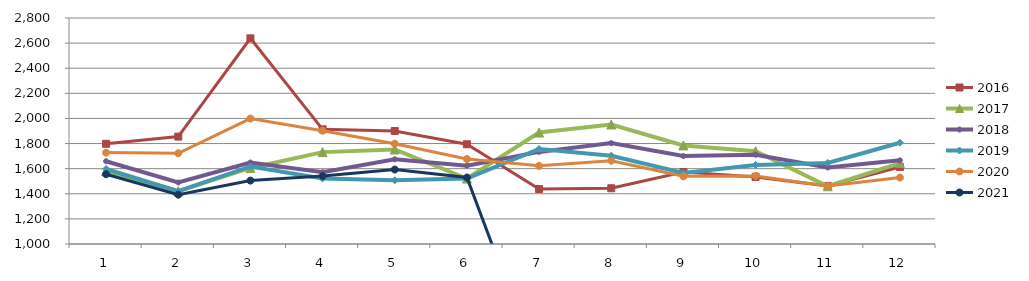
| Category | 2015 | 2016 | 2017 | 2018 | 2019 | 2020 | 2021 |
|---|---|---|---|---|---|---|---|
| 0 |  | 1798.146 | 1579.519 | 1659.233 | 1597.182 | 1727.767 | 1555.724 |
| 1 |  | 1855.266 | 1419.892 | 1490.116 | 1420.981 | 1722.949 | 1392.893 |
| 2 |  | 2637.962 | 1605.876 | 1649.429 | 1617.601 | 1999.15 | 1504.855 |
| 3 |  | 1913.237 | 1731.762 | 1571.732 | 1521.999 | 1902.268 | 1541.039 |
| 4 |  | 1900.309 | 1752.669 | 1674.727 | 1507.654 | 1798.925 | 1592.865 |
| 5 |  | 1794.333 | 1521.303 | 1624.201 | 1521.033 | 1676.477 | 1529.566 |
| 6 |  | 1437.75 | 1887.908 | 1733.621 | 1757.049 | 1622.712 | 0 |
| 7 |  | 1443.965 | 1951.735 | 1803.444 | 1702.894 | 1663.262 | 0 |
| 8 |  | 1573.366 | 1785.145 | 1700.265 | 1565.361 | 1539.017 | 0 |
| 9 |  | 1534.523 | 1739.554 | 1710.862 | 1629.894 | 1542.307 | 0 |
| 10 |  | 1461.686 | 1460 | 1609.178 | 1645.62 | 1461.483 | 0 |
| 11 |  | 1613.843 | 1644.49 | 1666.129 | 1806.739 | 1529.116 | 0 |